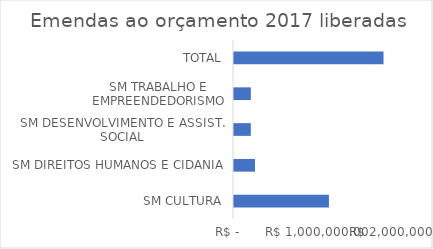
| Category | Series 0 |
|---|---|
| SM CULTURA | 1130000 |
| SM DIREITOS HUMANOS E CIDANIA | 250000 |
| SM DESENVOLVIMENTO E ASSIST. SOCIAL | 200000 |
| SM TRABALHO E EMPREENDEDORISMO | 200000 |
| TOTAL | 1780000 |